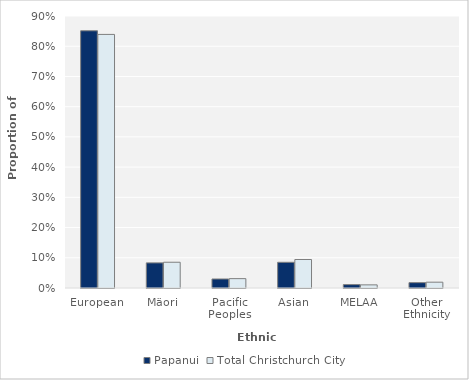
| Category | Papanui | Total Christchurch City |
|---|---|---|
| European | 0.851 | 0.839 |
| Mäori | 0.083 | 0.085 |
| Pacific Peoples | 0.03 | 0.031 |
| Asian | 0.085 | 0.094 |
| MELAA | 0.011 | 0.01 |
| Other Ethnicity | 0.018 | 0.019 |